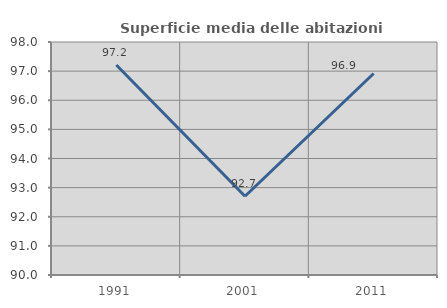
| Category | Superficie media delle abitazioni occupate |
|---|---|
| 1991.0 | 97.209 |
| 2001.0 | 92.705 |
| 2011.0 | 96.92 |